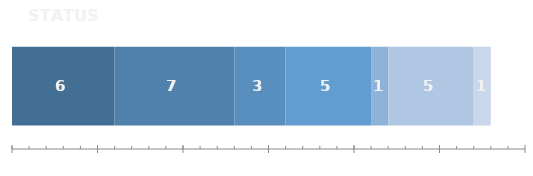
| Category | In Progress | Complete | In Review | On Hold | Blocked | Overdue | Not started |
|---|---|---|---|---|---|---|---|
| 0 | 6 | 7 | 3 | 5 | 1 | 5 | 1 |